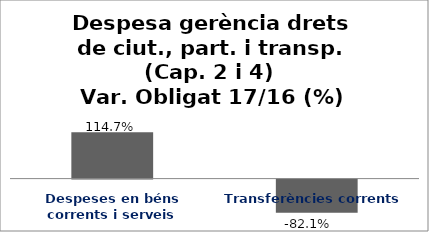
| Category | Series 0 |
|---|---|
| Despeses en béns corrents i serveis | 1.147 |
| Transferències corrents | -0.821 |